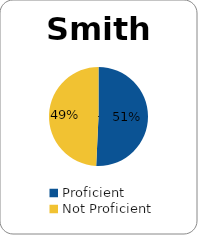
| Category | Series 0 |
|---|---|
| Proficient | 0.507 |
| Not Proficient | 0.493 |